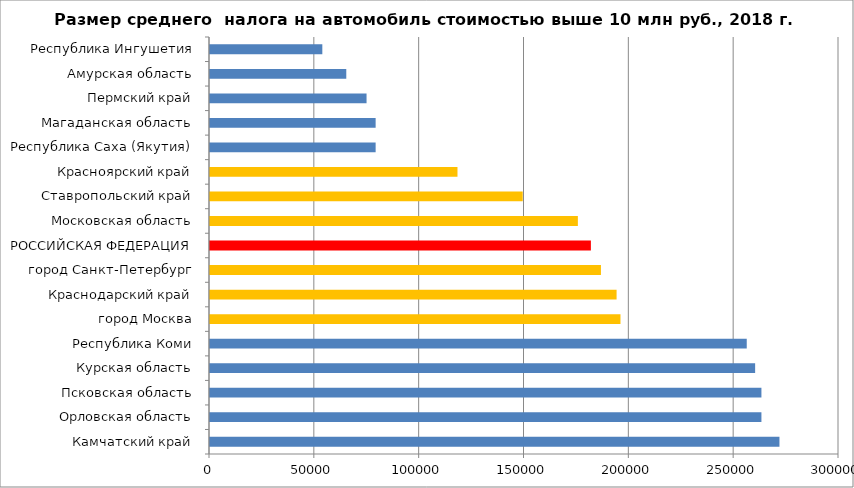
| Category | Размер среднего  налога на автомобиль стоимостью выше 10 млн 2018 |
|---|---|
| Камчатский край | 271600 |
| Орловская область | 263000 |
| Псковская область | 263000 |
| Курская область | 260000 |
| Республика Коми | 256000 |
| город Москва | 195775.33 |
| Краснодарский край | 193921.053 |
| город Санкт-Петербург | 186459.893 |
| РОССИЙСКАЯ ФЕДЕРАЦИЯ | 181659.851 |
| Московская область | 175452.632 |
| Ставропольский край | 149147.059 |
| Красноярский край | 118033.333 |
| Республика Саха (Якутия) | 79000 |
| Магаданская область | 79000 |
| Пермский край | 74666.667 |
| Амурская область | 65000 |
| Республика Ингушетия | 53571.429 |